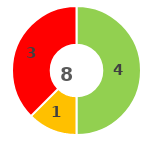
| Category | Series 0 |
|---|---|
| 0 | 0 |
| 1 | 4 |
| 2 | 1 |
| 3 | 3 |
| 4 | 0 |